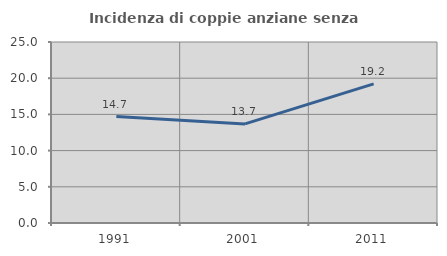
| Category | Incidenza di coppie anziane senza figli  |
|---|---|
| 1991.0 | 14.706 |
| 2001.0 | 13.688 |
| 2011.0 | 19.214 |